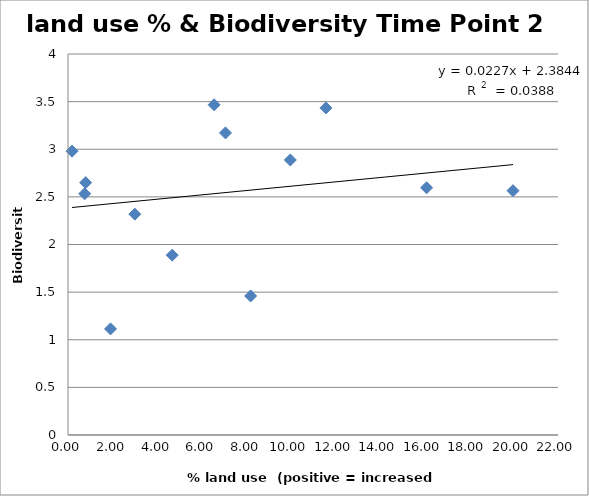
| Category | land use % |
|---|---|
| 3.0 | 2.318 |
| 6.56 | 3.467 |
| 4.68 | 1.888 |
| 0.79 | 2.649 |
| 11.58 | 3.434 |
| 7.07 | 3.171 |
| 0.18 | 2.98 |
| 8.2 | 1.46 |
| 16.1 | 2.596 |
| 19.98 | 2.565 |
| 1.91 | 1.114 |
| 9.98 | 2.887 |
| 0.75 | 2.532 |